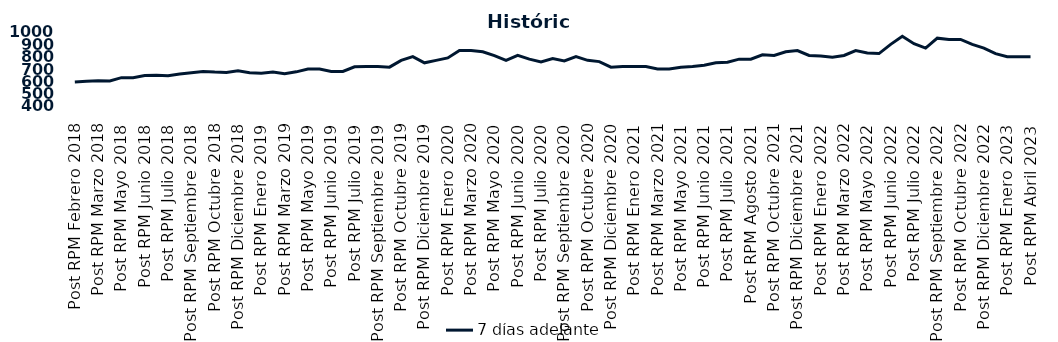
| Category | 7 días adelante  |
|---|---|
| Post RPM Febrero 2018 | 595 |
| Pre RPM Marzo 2018 | 600 |
| Post RPM Marzo 2018 | 605 |
| Pre RPM Mayo 2018 | 603 |
| Post RPM Mayo 2018 | 630 |
| Pre RPM Junio 2018 | 630 |
| Post RPM Junio 2018 | 646.5 |
| Pre RPM Julio 2018 | 650 |
| Post RPM Julio 2018 | 645 |
| Pre RPM Septiembre 2018 | 660 |
| Post RPM Septiembre 2018 | 670 |
| Pre RPM Octubre 2018 | 680 |
| Post RPM Octubre 2018 | 675 |
| Pre RPM Diciembre 2018 | 672.5 |
| Post RPM Diciembre 2018 | 685 |
| Pre RPM Enero 2019 | 670 |
| Post RPM Enero 2019 | 665 |
| Pre RPM Marzo 2019 | 675 |
| Post RPM Marzo 2019 | 661 |
| Pre RPM Mayo 2019 | 677 |
| Post RPM Mayo 2019 | 700 |
| Pre RPM Junio 2019 | 700.5 |
| Post RPM Junio 2019 | 680 |
| Pre RPM Julio 2019 | 680 |
| Post RPM Julio 2019 | 717.5 |
| Pre RPM Septiembre 2019 | 720 |
| Post RPM Septiembre 2019 | 720 |
| Pre RPM Octubre 2019 | 715 |
| Post RPM Octubre 2019 | 770 |
| Pre RPM Diciembre 2019 | 800 |
| Post RPM Diciembre 2019 | 750 |
| Pre RPM Enero 2020 | 770 |
| Post RPM Enero 2020 | 790 |
| Pre RPM Marzo 2020 | 850 |
| Post RPM Marzo 2020 | 850 |
| Pre RPM Mayo 2020 | 840 |
| Post RPM Mayo 2020 | 808.5 |
| Pre RPM Junio 2020 | 770 |
| Post RPM Junio 2020 | 810 |
| Pre RPM Julio 2020 | 780 |
| Post RPM Julio 2020 | 757 |
| Pre RPM Septiembre 2020 | 785 |
| Post RPM Septiembre 2020 | 765 |
| Pre RPM Octubre 2020 | 800 |
| Post RPM Octubre 2020 | 770 |
| Pre RPM Diciembre 2020 | 760 |
| Post RPM Diciembre 2020 | 715 |
| Pre RPM Enero 2021 | 720 |
| Post RPM Enero 2021 | 720 |
| Pre RPM Marzo 2021 | 720 |
| Post RPM Marzo 2021 | 700 |
| Pre RPM Mayo 2021 | 700 |
| Post RPM Mayo 2021 | 715 |
| Pre RPM Junio 2021 | 720 |
| Post RPM Junio 2021 | 730 |
| Pre RPM Julio 2021 | 750 |
| Post RPM Julio 2021 | 755 |
| Pre RPM Agosto 2021 | 780 |
| Post RPM Agosto 2021 | 780 |
| Pre RPM Octubre 2021 | 815 |
| Post RPM Octubre 2021 | 810 |
| Pre RPM Diciembre 2021 | 840 |
| Post RPM Diciembre 2021 | 850 |
| Pre RPM Enero 2022 | 810 |
| Post RPM Enero 2022 | 805 |
| Pre RPM Marzo 2022 | 795 |
| Post RPM Marzo 2022 | 810 |
| Pre RPM Mayo 2022 | 850 |
| Post RPM Mayo 2022 | 830 |
| Pre RPM Junio 2022 | 825 |
| Post RPM Junio 2022 | 900 |
| Pre RPM Julio 2022 | 965 |
| Post RPM Julio 2022 | 905 |
| Pre RPM Septiembre 2022 | 870 |
| Post RPM Septiembre 2022 | 950 |
| Pre RPM Octubre 2022 | 940 |
| Post RPM Octubre 2022 | 940 |
| Pre RPM Diciembre 2022 | 900 |
| Post RPM Diciembre 2022 | 870 |
| Pre RPM Enero 2023 | 825 |
| Post RPM Enero 2023 | 800 |
| Pre RPM Abril 2023 | 800 |
| Post RPM Abril 2023 | 800 |